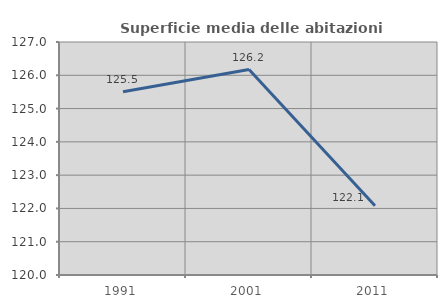
| Category | Superficie media delle abitazioni occupate |
|---|---|
| 1991.0 | 125.503 |
| 2001.0 | 126.171 |
| 2011.0 | 122.08 |